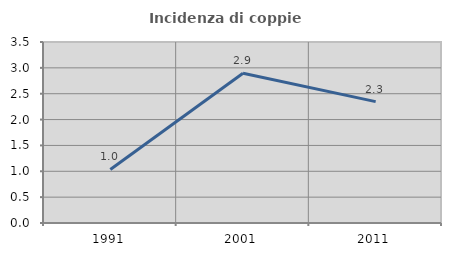
| Category | Incidenza di coppie miste |
|---|---|
| 1991.0 | 1.035 |
| 2001.0 | 2.895 |
| 2011.0 | 2.347 |